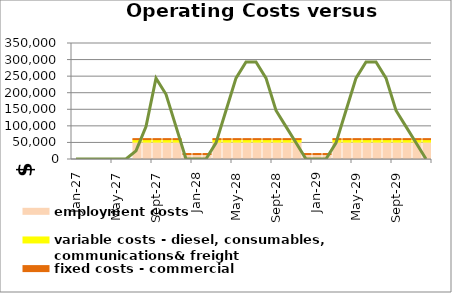
| Category | employment costs | variable costs - diesel, consumables, communications& freight | fixed costs - commercial |
|---|---|---|---|
| 2027-01-01 | 0 | 0 | 0 |
| 2027-02-01 | 0 | 0 | 0 |
| 2027-03-01 | 0 | 0 | 0 |
| 2027-04-01 | 0 | 0 | 0 |
| 2027-05-01 | 0 | 0 | 0 |
| 2027-06-01 | 0 | 0 | 0 |
| 2027-07-01 | 52500 | 7500 | 3000 |
| 2027-08-01 | 52500 | 7500 | 3000 |
| 2027-09-01 | 52500 | 7500 | 3000 |
| 2027-10-01 | 52500 | 7500 | 3000 |
| 2027-11-01 | 52500 | 7500 | 3000 |
| 2027-12-01 | 15000 | 0 | 3000 |
| 2028-01-01 | 15000 | 0 | 3000 |
| 2028-02-01 | 15000 | 0 | 3000 |
| 2028-03-01 | 52500 | 7500 | 3000 |
| 2028-04-01 | 52500 | 7500 | 3000 |
| 2028-05-01 | 52500 | 7500 | 3000 |
| 2028-06-01 | 52500 | 7500 | 3000 |
| 2028-07-01 | 52500 | 7500 | 3000 |
| 2028-08-01 | 52500 | 7500 | 3000 |
| 2028-09-01 | 52500 | 7500 | 3000 |
| 2028-10-01 | 52500 | 7500 | 3000 |
| 2028-11-01 | 52500 | 7500 | 3000 |
| 2028-12-01 | 15000 | 0 | 3000 |
| 2029-01-01 | 15000 | 0 | 3000 |
| 2029-02-01 | 15000 | 0 | 3000 |
| 2029-03-01 | 52500 | 7500 | 3000 |
| 2029-04-01 | 52500 | 7500 | 3000 |
| 2029-05-01 | 52500 | 7500 | 3000 |
| 2029-06-01 | 52500 | 7500 | 3000 |
| 2029-07-01 | 52500 | 7500 | 3000 |
| 2029-08-01 | 52500 | 7500 | 3000 |
| 2029-09-01 | 52500 | 7500 | 3000 |
| 2029-10-01 | 52500 | 7500 | 3000 |
| 2029-11-01 | 52500 | 7500 | 3000 |
| 2029-12-01 | 52500 | 7500 | 3000 |